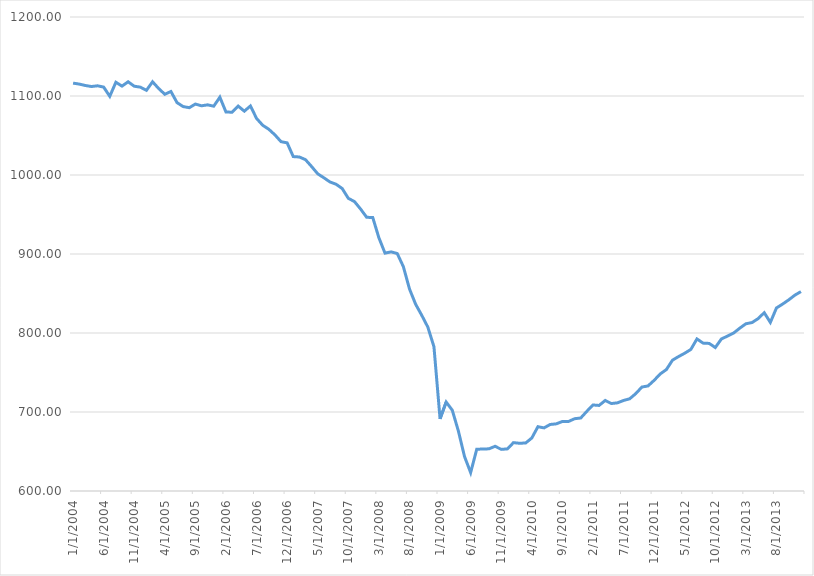
| Category | Series 0 |
|---|---|
| 1/1/04 | 1116.3 |
| 2/1/04 | 1115.1 |
| 3/1/04 | 1113.3 |
| 4/1/04 | 1112 |
| 5/1/04 | 1112.9 |
| 6/1/04 | 1111.3 |
| 7/1/04 | 1099.6 |
| 8/1/04 | 1117.4 |
| 9/1/04 | 1112.5 |
| 10/1/04 | 1118 |
| 11/1/04 | 1112.4 |
| 12/1/04 | 1111.2 |
| 1/1/05 | 1107.2 |
| 2/1/05 | 1118 |
| 3/1/05 | 1109.4 |
| 4/1/05 | 1102.2 |
| 5/1/05 | 1105.7 |
| 6/1/05 | 1091.6 |
| 7/1/05 | 1086.6 |
| 8/1/05 | 1085.2 |
| 9/1/05 | 1089.8 |
| 10/1/05 | 1087.6 |
| 11/1/05 | 1088.8 |
| 12/1/05 | 1087.1 |
| 1/1/06 | 1098.5 |
| 2/1/06 | 1079.7 |
| 3/1/06 | 1079.5 |
| 4/1/06 | 1087.2 |
| 5/1/06 | 1080.8 |
| 6/1/06 | 1087.4 |
| 7/1/06 | 1071.6 |
| 8/1/06 | 1063 |
| 9/1/06 | 1057.9 |
| 10/1/06 | 1050.8 |
| 11/1/06 | 1042.2 |
| 12/1/06 | 1040.7 |
| 1/1/07 | 1023.3 |
| 2/1/07 | 1022.8 |
| 3/1/07 | 1019.4 |
| 4/1/07 | 1010.7 |
| 5/1/07 | 1001.5 |
| 6/1/07 | 996.5 |
| 7/1/07 | 991.2 |
| 8/1/07 | 988.3 |
| 9/1/07 | 982.9 |
| 10/1/07 | 970.5 |
| 11/1/07 | 966.4 |
| 12/1/07 | 957 |
| 1/1/08 | 946.5 |
| 2/1/08 | 946.1 |
| 3/1/08 | 920.5 |
| 4/1/08 | 901.1 |
| 5/1/08 | 902.7 |
| 6/1/08 | 900.6 |
| 7/1/08 | 884 |
| 8/1/08 | 855.8 |
| 9/1/08 | 836.5 |
| 10/1/08 | 822.5 |
| 11/1/08 | 807.5 |
| 12/1/08 | 782.7 |
| 1/1/09 | 691.3 |
| 2/1/09 | 712.6 |
| 3/1/09 | 702.2 |
| 4/1/09 | 675.8 |
| 5/1/09 | 643.6 |
| 6/1/09 | 623.3 |
| 7/1/09 | 652.9 |
| 8/1/09 | 653.1 |
| 9/1/09 | 653.4 |
| 10/1/09 | 656.6 |
| 11/1/09 | 652.7 |
| 12/1/09 | 653.3 |
| 1/1/10 | 661.2 |
| 2/1/10 | 660.4 |
| 3/1/10 | 660.8 |
| 4/1/10 | 667.1 |
| 5/1/10 | 681.4 |
| 6/1/10 | 679.9 |
| 7/1/10 | 684.2 |
| 8/1/10 | 685 |
| 9/1/10 | 688 |
| 10/1/10 | 688 |
| 11/1/10 | 691.5 |
| 12/1/10 | 692.4 |
| 1/1/11 | 700.9 |
| 2/1/11 | 708.9 |
| 3/1/11 | 708.3 |
| 4/1/11 | 714.6 |
| 5/1/11 | 710.7 |
| 6/1/11 | 711.6 |
| 7/1/11 | 714.6 |
| 8/1/11 | 716.7 |
| 9/1/11 | 723.3 |
| 10/1/11 | 731.6 |
| 11/1/11 | 733 |
| 12/1/11 | 740.1 |
| 1/1/12 | 748.2 |
| 2/1/12 | 753.7 |
| 3/1/12 | 765.6 |
| 4/1/12 | 770.2 |
| 5/1/12 | 774.4 |
| 6/1/12 | 779.2 |
| 7/1/12 | 792.5 |
| 8/1/12 | 787.2 |
| 9/1/12 | 786.8 |
| 10/1/12 | 781.6 |
| 11/1/12 | 792.5 |
| 12/1/12 | 796.1 |
| 1/1/13 | 800 |
| 2/1/13 | 806.1 |
| 3/1/13 | 811.7 |
| 4/1/13 | 813.2 |
| 5/1/13 | 818.2 |
| 6/1/13 | 825.7 |
| 7/1/13 | 813.4 |
| 8/1/13 | 831.7 |
| 9/1/13 | 836.6 |
| 10/1/13 | 841.9 |
| 11/1/13 | 847.9 |
| 12/1/13 | 852.4 |